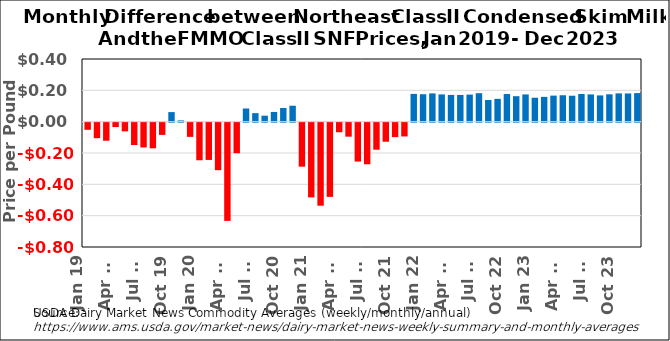
| Category | Series 0 |
|---|---|
| 2019-01-01 | -0.045 |
| 2019-02-01 | -0.099 |
| 2019-03-01 | -0.115 |
| 2019-04-01 | -0.028 |
| 2019-05-01 | -0.055 |
| 2019-06-01 | -0.143 |
| 2019-07-01 | -0.158 |
| 2019-08-01 | -0.164 |
| 2019-09-01 | -0.078 |
| 2019-10-01 | 0.061 |
| 2019-11-01 | 0.008 |
| 2019-12-01 | -0.091 |
| 2020-01-01 | -0.24 |
| 2020-02-01 | -0.238 |
| 2020-03-01 | -0.303 |
| 2020-04-01 | -0.627 |
| 2020-05-01 | -0.195 |
| 2020-06-01 | 0.084 |
| 2020-07-01 | 0.054 |
| 2020-08-01 | 0.038 |
| 2020-09-01 | 0.062 |
| 2020-10-01 | 0.087 |
| 2020-11-01 | 0.102 |
| 2020-12-01 | -0.281 |
| 2021-01-01 | -0.477 |
| 2021-02-01 | -0.53 |
| 2021-03-01 | -0.474 |
| 2021-04-01 | -0.061 |
| 2021-05-01 | -0.089 |
| 2021-06-01 | -0.248 |
| 2021-07-01 | -0.265 |
| 2021-08-01 | -0.173 |
| 2021-09-01 | -0.122 |
| 2021-10-01 | -0.092 |
| 2021-11-01 | -0.088 |
| 2021-12-01 | 0.177 |
| 2022-01-01 | 0.175 |
| 2022-02-01 | 0.18 |
| 2022-03-01 | 0.174 |
| 2022-04-01 | 0.171 |
| 2022-05-01 | 0.171 |
| 2022-06-01 | 0.173 |
| 2022-07-01 | 0.182 |
| 2022-08-01 | 0.138 |
| 2022-09-01 | 0.146 |
| 2022-10-01 | 0.176 |
| 2022-11-01 | 0.163 |
| 2022-12-01 | 0.174 |
| 2023-01-01 | 0.153 |
| 2023-02-01 | 0.158 |
| 2023-03-01 | 0.166 |
| 2023-04-01 | 0.169 |
| 2023-05-01 | 0.166 |
| 2023-06-01 | 0.177 |
| 2023-07-01 | 0.174 |
| 2023-08-01 | 0.168 |
| 2023-09-01 | 0.175 |
| 2023-10-01 | 0.18 |
| 2023-11-01 | 0.18 |
| 2023-12-01 | 0.182 |